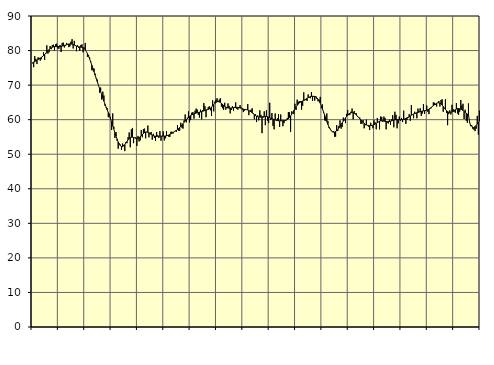
| Category | Piggar | Series 1 |
|---|---|---|
| nan | 76.3 | 76.49 |
| 87.0 | 75.2 | 76.65 |
| 87.0 | 78.4 | 76.78 |
| 87.0 | 77.6 | 77 |
| 87.0 | 76.1 | 77.2 |
| 87.0 | 78 | 77.4 |
| 87.0 | 77.9 | 77.59 |
| 87.0 | 77.1 | 77.8 |
| 87.0 | 77.5 | 78.01 |
| 87.0 | 78.4 | 78.26 |
| 87.0 | 79.5 | 78.55 |
| 87.0 | 77.3 | 78.87 |
| nan | 79 | 79.21 |
| 88.0 | 81.5 | 79.58 |
| 88.0 | 79.1 | 79.94 |
| 88.0 | 79.5 | 80.27 |
| 88.0 | 81.3 | 80.57 |
| 88.0 | 80.4 | 80.8 |
| 88.0 | 81.6 | 80.97 |
| 88.0 | 81.7 | 81.08 |
| 88.0 | 80 | 81.14 |
| 88.0 | 81.8 | 81.16 |
| 88.0 | 82 | 81.16 |
| 88.0 | 80.6 | 81.16 |
| nan | 80.5 | 81.18 |
| 89.0 | 81.6 | 81.19 |
| 89.0 | 79.6 | 81.22 |
| 89.0 | 82.2 | 81.29 |
| 89.0 | 82.3 | 81.37 |
| 89.0 | 80.9 | 81.48 |
| 89.0 | 81.4 | 81.59 |
| 89.0 | 82.2 | 81.71 |
| 89.0 | 81.9 | 81.82 |
| 89.0 | 81 | 81.89 |
| 89.0 | 81.2 | 81.92 |
| 89.0 | 82.6 | 81.9 |
| nan | 83.3 | 81.84 |
| 90.0 | 80.6 | 81.73 |
| 90.0 | 82.8 | 81.6 |
| 90.0 | 81.6 | 81.46 |
| 90.0 | 79.8 | 81.32 |
| 90.0 | 81.5 | 81.2 |
| 90.0 | 80.8 | 81.11 |
| 90.0 | 79.9 | 81.05 |
| 90.0 | 81.6 | 80.99 |
| 90.0 | 81.8 | 80.92 |
| 90.0 | 79.5 | 80.79 |
| 90.0 | 80.9 | 80.57 |
| nan | 82.2 | 80.21 |
| 91.0 | 79.7 | 79.71 |
| 91.0 | 78.2 | 79.1 |
| 91.0 | 78.7 | 78.36 |
| 91.0 | 78 | 77.55 |
| 91.0 | 76.9 | 76.68 |
| 91.0 | 74.3 | 75.76 |
| 91.0 | 74.3 | 74.81 |
| 91.0 | 74.8 | 73.86 |
| 91.0 | 73.3 | 72.89 |
| 91.0 | 71.8 | 71.93 |
| 91.0 | 71.6 | 70.98 |
| nan | 69.9 | 70.02 |
| 92.0 | 67.8 | 69.06 |
| 92.0 | 69.3 | 68.11 |
| 92.0 | 65.8 | 67.17 |
| 92.0 | 68.1 | 66.24 |
| 92.0 | 67 | 65.34 |
| 92.0 | 64 | 64.48 |
| 92.0 | 63.5 | 63.65 |
| 92.0 | 63.3 | 62.85 |
| 92.0 | 60.7 | 62.03 |
| 92.0 | 61.7 | 61.17 |
| 92.0 | 60.8 | 60.27 |
| nan | 57 | 59.31 |
| 93.0 | 61.8 | 58.3 |
| 93.0 | 58 | 57.28 |
| 93.0 | 54.7 | 56.26 |
| 93.0 | 56.4 | 55.27 |
| 93.0 | 53.9 | 54.35 |
| 93.0 | 51.6 | 53.54 |
| 93.0 | 53.1 | 52.91 |
| 93.0 | 52.8 | 52.45 |
| 93.0 | 51.3 | 52.22 |
| 93.0 | 53.1 | 52.21 |
| 93.0 | 52.7 | 52.4 |
| nan | 50.9 | 52.76 |
| 94.0 | 53.5 | 53.22 |
| 94.0 | 53.2 | 53.7 |
| 94.0 | 54.9 | 54.16 |
| 94.0 | 56.3 | 54.54 |
| 94.0 | 52 | 54.8 |
| 94.0 | 57.2 | 54.93 |
| 94.0 | 57.6 | 54.94 |
| 94.0 | 53.2 | 54.85 |
| 94.0 | 54.7 | 54.73 |
| 94.0 | 54.9 | 54.62 |
| 94.0 | 52.4 | 54.56 |
| nan | 55.3 | 54.61 |
| 95.0 | 53.7 | 54.76 |
| 95.0 | 54 | 55.02 |
| 95.0 | 57 | 55.34 |
| 95.0 | 54.9 | 55.69 |
| 95.0 | 57.3 | 56.01 |
| 95.0 | 57.4 | 56.27 |
| 95.0 | 54.6 | 56.41 |
| 95.0 | 56.5 | 56.42 |
| 95.0 | 58.3 | 56.33 |
| 95.0 | 54.9 | 56.15 |
| 95.0 | 56.3 | 55.94 |
| nan | 56.4 | 55.72 |
| 96.0 | 54.2 | 55.52 |
| 96.0 | 55.9 | 55.37 |
| 96.0 | 54.7 | 55.27 |
| 96.0 | 53.9 | 55.2 |
| 96.0 | 56.4 | 55.17 |
| 96.0 | 55.5 | 55.17 |
| 96.0 | 54.7 | 55.19 |
| 96.0 | 56.7 | 55.22 |
| 96.0 | 53.9 | 55.24 |
| 96.0 | 55.2 | 55.24 |
| 96.0 | 56.6 | 55.25 |
| nan | 54 | 55.26 |
| 97.0 | 54.6 | 55.28 |
| 97.0 | 56.7 | 55.34 |
| 97.0 | 55.3 | 55.43 |
| 97.0 | 55.1 | 55.55 |
| 97.0 | 55 | 55.71 |
| 97.0 | 56.5 | 55.9 |
| 97.0 | 56.5 | 56.09 |
| 97.0 | 56 | 56.29 |
| 97.0 | 56.5 | 56.48 |
| 97.0 | 56.8 | 56.69 |
| 97.0 | 56.5 | 56.89 |
| nan | 58.4 | 57.12 |
| 98.0 | 56.8 | 57.4 |
| 98.0 | 56.8 | 57.71 |
| 98.0 | 59.1 | 58.06 |
| 98.0 | 57.7 | 58.44 |
| 98.0 | 57.4 | 58.84 |
| 98.0 | 59.8 | 59.24 |
| 98.0 | 61.5 | 59.61 |
| 98.0 | 59.2 | 59.96 |
| 98.0 | 60.6 | 60.29 |
| 98.0 | 62.4 | 60.6 |
| 98.0 | 59.2 | 60.9 |
| nan | 59.9 | 61.16 |
| 99.0 | 62 | 61.37 |
| 99.0 | 62.2 | 61.55 |
| 99.0 | 60.3 | 61.69 |
| 99.0 | 62.6 | 61.81 |
| 99.0 | 63.2 | 61.92 |
| 99.0 | 62.9 | 62.01 |
| 99.0 | 61.4 | 62.08 |
| 99.0 | 60.6 | 62.15 |
| 99.0 | 62.9 | 62.24 |
| 99.0 | 60.1 | 62.33 |
| 99.0 | 62.8 | 62.43 |
| nan | 64.8 | 62.54 |
| 0.0 | 63.9 | 62.65 |
| 0.0 | 60.7 | 62.75 |
| 0.0 | 63 | 62.86 |
| 0.0 | 63.6 | 62.98 |
| 0.0 | 63.9 | 63.13 |
| 0.0 | 62.7 | 63.33 |
| 0.0 | 61.1 | 63.62 |
| 0.0 | 65.6 | 63.97 |
| 0.0 | 62.4 | 64.35 |
| 0.0 | 65.2 | 64.71 |
| 0.0 | 65.8 | 65.01 |
| nan | 66.2 | 65.18 |
| 1.0 | 65.4 | 65.23 |
| 1.0 | 65.8 | 65.16 |
| 1.0 | 66.2 | 64.99 |
| 1.0 | 63.8 | 64.74 |
| 1.0 | 63.3 | 64.44 |
| 1.0 | 62.8 | 64.13 |
| 1.0 | 64.9 | 63.85 |
| 1.0 | 62.9 | 63.63 |
| 1.0 | 63.7 | 63.47 |
| 1.0 | 64.7 | 63.39 |
| 1.0 | 64 | 63.34 |
| nan | 61.8 | 63.34 |
| 2.0 | 62.8 | 63.36 |
| 2.0 | 63.9 | 63.4 |
| 2.0 | 62.6 | 63.45 |
| 2.0 | 63.7 | 63.49 |
| 2.0 | 65 | 63.53 |
| 2.0 | 63.1 | 63.54 |
| 2.0 | 62.9 | 63.53 |
| 2.0 | 63.7 | 63.48 |
| 2.0 | 64.2 | 63.4 |
| 2.0 | 63.5 | 63.28 |
| 2.0 | 62.9 | 63.16 |
| nan | 62.2 | 63.05 |
| 3.0 | 62.6 | 62.98 |
| 3.0 | 62.8 | 62.93 |
| 3.0 | 62.8 | 62.88 |
| 3.0 | 64.5 | 62.8 |
| 3.0 | 61.3 | 62.66 |
| 3.0 | 62.4 | 62.47 |
| 3.0 | 62.9 | 62.25 |
| 3.0 | 63.3 | 61.98 |
| 3.0 | 61.9 | 61.71 |
| 3.0 | 60.1 | 61.43 |
| 3.0 | 61.6 | 61.19 |
| nan | 59.3 | 61.01 |
| 4.0 | 61.2 | 60.88 |
| 4.0 | 59.8 | 60.79 |
| 4.0 | 62.7 | 60.75 |
| 4.0 | 61.4 | 60.74 |
| 4.0 | 56.1 | 60.79 |
| 4.0 | 60.6 | 60.86 |
| 4.0 | 62.4 | 60.93 |
| 4.0 | 58.4 | 60.95 |
| 4.0 | 62.7 | 60.92 |
| 4.0 | 59.7 | 60.84 |
| 4.0 | 59 | 60.73 |
| nan | 64.9 | 60.59 |
| 5.0 | 59.9 | 60.44 |
| 5.0 | 61.9 | 60.3 |
| 5.0 | 58.2 | 60.17 |
| 5.0 | 57.2 | 60.05 |
| 5.0 | 61.8 | 59.94 |
| 5.0 | 59.7 | 59.84 |
| 5.0 | 60.4 | 59.74 |
| 5.0 | 61.6 | 59.68 |
| 5.0 | 57.9 | 59.66 |
| 5.0 | 61.5 | 59.66 |
| 5.0 | 59.8 | 59.68 |
| nan | 58.1 | 59.69 |
| 6.0 | 59 | 59.71 |
| 6.0 | 59.6 | 59.75 |
| 6.0 | 59.8 | 59.84 |
| 6.0 | 60.5 | 60.02 |
| 6.0 | 62.2 | 60.28 |
| 6.0 | 62.1 | 60.64 |
| 6.0 | 56.5 | 61.08 |
| 6.0 | 62.4 | 61.58 |
| 6.0 | 62.1 | 62.11 |
| 6.0 | 61.6 | 62.66 |
| 6.0 | 64.6 | 63.19 |
| nan | 62.8 | 63.69 |
| 7.0 | 65.8 | 64.14 |
| 7.0 | 65.2 | 64.53 |
| 7.0 | 65.3 | 64.84 |
| 7.0 | 65.4 | 65.08 |
| 7.0 | 62.9 | 65.27 |
| 7.0 | 64 | 65.42 |
| 7.0 | 67.9 | 65.58 |
| 7.0 | 65.6 | 65.76 |
| 7.0 | 65.7 | 65.96 |
| 7.0 | 65.4 | 66.17 |
| 7.0 | 67.3 | 66.37 |
| nan | 66.4 | 66.53 |
| 8.0 | 66.2 | 66.66 |
| 8.0 | 68 | 66.73 |
| 8.0 | 65.4 | 66.77 |
| 8.0 | 66.6 | 66.76 |
| 8.0 | 65.5 | 66.7 |
| 8.0 | 66.8 | 66.57 |
| 8.0 | 66 | 66.31 |
| 8.0 | 65.3 | 65.92 |
| 8.0 | 65.8 | 65.4 |
| 8.0 | 66.6 | 64.76 |
| 8.0 | 63.3 | 64 |
| nan | 64.4 | 63.15 |
| 9.0 | 62 | 62.25 |
| 9.0 | 59.8 | 61.31 |
| 9.0 | 59.7 | 60.37 |
| 9.0 | 61.8 | 59.47 |
| 9.0 | 59.6 | 58.62 |
| 9.0 | 57.6 | 57.88 |
| 9.0 | 57.4 | 57.27 |
| 9.0 | 56.7 | 56.82 |
| 9.0 | 56.4 | 56.53 |
| 9.0 | 56.7 | 56.4 |
| 9.0 | 55.1 | 56.41 |
| nan | 55.1 | 56.54 |
| 10.0 | 58.4 | 56.79 |
| 10.0 | 56.7 | 57.14 |
| 10.0 | 58.2 | 57.58 |
| 10.0 | 59.8 | 58.05 |
| 10.0 | 57.4 | 58.55 |
| 10.0 | 57.9 | 59.07 |
| 10.0 | 60.6 | 59.57 |
| 10.0 | 59.8 | 60.06 |
| 10.0 | 59 | 60.52 |
| 10.0 | 61.7 | 60.94 |
| 10.0 | 62.8 | 61.31 |
| nan | 61.3 | 61.63 |
| 11.0 | 61.4 | 61.87 |
| 11.0 | 62.3 | 62.01 |
| 11.0 | 63.2 | 62.05 |
| 11.0 | 60.1 | 62 |
| 11.0 | 62.5 | 61.84 |
| 11.0 | 61.8 | 61.61 |
| 11.0 | 61.8 | 61.32 |
| 11.0 | 60.8 | 60.99 |
| 11.0 | 60.7 | 60.64 |
| 11.0 | 60.6 | 60.27 |
| 11.0 | 58.8 | 59.9 |
| nan | 58.8 | 59.54 |
| 12.0 | 59.9 | 59.2 |
| 12.0 | 57.5 | 58.91 |
| 12.0 | 58.4 | 58.67 |
| 12.0 | 60 | 58.48 |
| 12.0 | 58.3 | 58.36 |
| 12.0 | 58 | 58.29 |
| 12.0 | 57 | 58.27 |
| 12.0 | 59.1 | 58.28 |
| 12.0 | 58.4 | 58.34 |
| 12.0 | 57.5 | 58.42 |
| 12.0 | 59.8 | 58.55 |
| nan | 59.2 | 58.73 |
| 13.0 | 57.2 | 58.93 |
| 13.0 | 60.5 | 59.15 |
| 13.0 | 59.3 | 59.36 |
| 13.0 | 57.2 | 59.52 |
| 13.0 | 60.9 | 59.62 |
| 13.0 | 60.8 | 59.67 |
| 13.0 | 59.4 | 59.66 |
| 13.0 | 60.9 | 59.61 |
| 13.0 | 60.5 | 59.53 |
| 13.0 | 57.2 | 59.47 |
| 13.0 | 59.1 | 59.43 |
| nan | 58.9 | 59.43 |
| 14.0 | 60 | 59.47 |
| 14.0 | 58.5 | 59.55 |
| 14.0 | 60.1 | 59.65 |
| 14.0 | 61.3 | 59.76 |
| 14.0 | 57.8 | 59.86 |
| 14.0 | 62.3 | 59.94 |
| 14.0 | 61.4 | 60 |
| 14.0 | 57.5 | 60.02 |
| 14.0 | 58.9 | 60.02 |
| 14.0 | 60.9 | 60 |
| 14.0 | 59.7 | 59.99 |
| nan | 60.5 | 59.99 |
| 15.0 | 59.3 | 60.03 |
| 15.0 | 62.6 | 60.1 |
| 15.0 | 59.9 | 60.22 |
| 15.0 | 58.8 | 60.37 |
| 15.0 | 59.9 | 60.53 |
| 15.0 | 60.5 | 60.71 |
| 15.0 | 61.6 | 60.88 |
| 15.0 | 59.7 | 61.07 |
| 15.0 | 64.2 | 61.27 |
| 15.0 | 61.4 | 61.46 |
| 15.0 | 60.4 | 61.64 |
| nan | 62.3 | 61.78 |
| 16.0 | 61.7 | 61.9 |
| 16.0 | 60.4 | 62 |
| 16.0 | 63.2 | 62.09 |
| 16.0 | 62.5 | 62.19 |
| 16.0 | 63.3 | 62.3 |
| 16.0 | 61.1 | 62.4 |
| 16.0 | 61.8 | 62.48 |
| 16.0 | 64.5 | 62.54 |
| 16.0 | 61.7 | 62.59 |
| 16.0 | 62.5 | 62.65 |
| 16.0 | 64.1 | 62.74 |
| nan | 62.3 | 62.87 |
| 17.0 | 61.6 | 63.04 |
| 17.0 | 63.4 | 63.25 |
| 17.0 | 63.3 | 63.5 |
| 17.0 | 63.7 | 63.76 |
| 17.0 | 65 | 64.03 |
| 17.0 | 64.9 | 64.29 |
| 17.0 | 64.3 | 64.54 |
| 17.0 | 63.8 | 64.74 |
| 17.0 | 64.9 | 64.87 |
| 17.0 | 65.4 | 64.9 |
| 17.0 | 63.8 | 64.8 |
| nan | 65.7 | 64.56 |
| 18.0 | 65.9 | 64.23 |
| 18.0 | 62.3 | 63.83 |
| 18.0 | 63.4 | 63.4 |
| 18.0 | 65.9 | 62.97 |
| 18.0 | 62 | 62.61 |
| 18.0 | 58.4 | 62.34 |
| 18.0 | 61.6 | 62.18 |
| 18.0 | 62.7 | 62.11 |
| 18.0 | 61.5 | 62.14 |
| 18.0 | 64.3 | 62.25 |
| 18.0 | 63.1 | 62.42 |
| nan | 62.3 | 62.64 |
| 19.0 | 62 | 62.87 |
| 19.0 | 64.8 | 63.06 |
| 19.0 | 61.8 | 63.18 |
| 19.0 | 61.4 | 63.21 |
| 19.0 | 62.3 | 63.15 |
| 19.0 | 65.7 | 63.03 |
| 19.0 | 64.1 | 62.87 |
| 19.0 | 64.6 | 62.66 |
| 19.0 | 60.2 | 62.41 |
| 19.0 | 62.9 | 62.14 |
| 19.0 | 59.7 | 61.87 |
| nan | 59.1 | 61.62 |
| 20.0 | 64.7 | 61.41 |
| 20.0 | 59.2 | 59.36 |
| 20.0 | 58.3 | 58.15 |
| 20.0 | 58.4 | 58.23 |
| 20.0 | 57.9 | 57.43 |
| 20.0 | 57.1 | 57.69 |
| 20.0 | 56.7 | 58 |
| 20.0 | 57.4 | 58.34 |
| 20.0 | 61.1 | 58.73 |
| 20.0 | 55.7 | 59.14 |
| 20.0 | 62.6 | 59.56 |